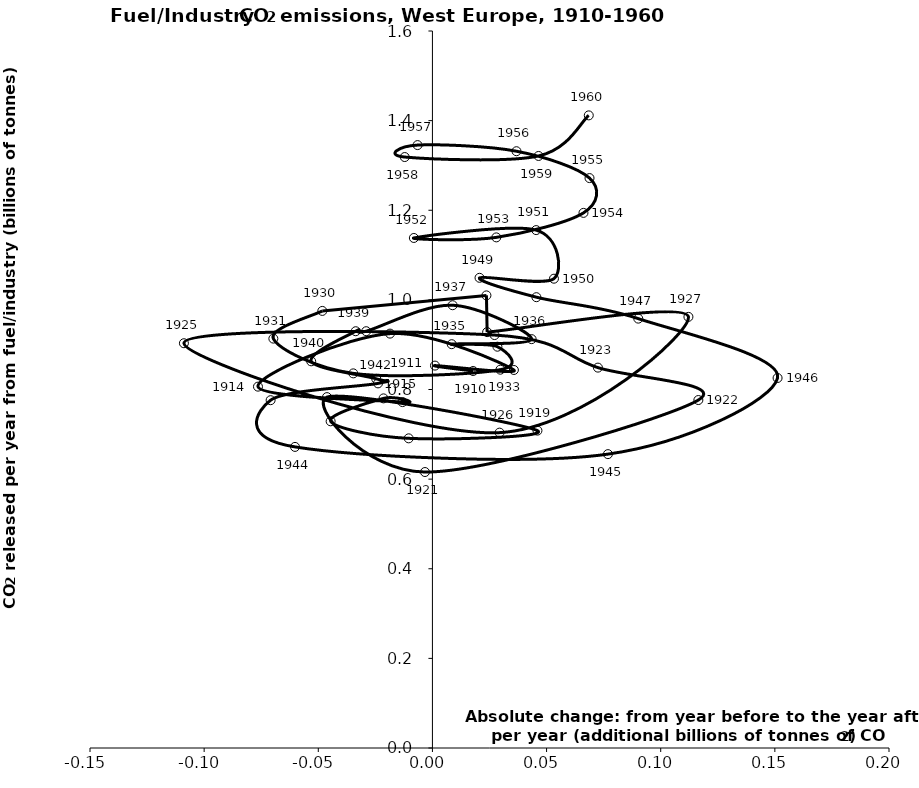
| Category | Series 0 |
|---|---|
| 0.01781619999999995 | 0.841 |
| 0.0011193520000000179 | 0.853 |
| 0.03568552800000002 | 0.844 |
| -0.01858014400000002 | 0.925 |
| -0.07641821599999998 | 0.806 |
| -0.013091471999999993 | 0.772 |
| -0.021425240000000012 | 0.78 |
| -0.04459088 | 0.729 |
| -0.010398432000000013 | 0.691 |
| 0.046003352 | 0.708 |
| -0.04619754399999998 | 0.783 |
| -0.0032627920000000143 | 0.616 |
| 0.11649504800000005 | 0.776 |
| 0.07249956800000001 | 0.849 |
| 0.027216191999999917 | 0.921 |
| -0.10886293600000002 | 0.903 |
| 0.02940726399999999 | 0.704 |
| 0.11214038399999998 | 0.962 |
| 0.02396622400000009 | 0.928 |
| 0.02365661600000002 | 1.01 |
| -0.048231064000000046 | 0.975 |
| -0.06968378399999997 | 0.914 |
| -0.034670599999999996 | 0.836 |
| 0.029755344000000017 | 0.844 |
| 0.028467448000000006 | 0.895 |
| 0.008449183999999943 | 0.901 |
| 0.04346053600000005 | 0.912 |
| 0.008844895999999991 | 0.988 |
| -0.0290023920000001 | 0.93 |
| -0.03360437599999999 | 0.93 |
| -0.05310601599999998 | 0.863 |
| -0.02460742399999999 | 0.824 |
| -0.023836152 | 0.814 |
| -0.07088191200000005 | 0.776 |
| -0.06019585599999999 | 0.672 |
| 0.07688354400000003 | 0.656 |
| 0.15119129600000003 | 0.826 |
| 0.09016737600000002 | 0.958 |
| 0.04554351999999995 | 1.006 |
| 0.020631984000000103 | 1.049 |
| 0.053232424000000056 | 1.047 |
| 0.04544092799999999 | 1.156 |
| -0.00812858400000005 | 1.138 |
| 0.027987463999999962 | 1.139 |
| 0.06616451200000006 | 1.194 |
| 0.068811752 | 1.272 |
| 0.03681220799999996 | 1.332 |
| -0.0065090960000000475 | 1.345 |
| -0.012133335999999995 | 1.319 |
| 0.04649249600000005 | 1.321 |
| 0.06848382399999997 | 1.412 |